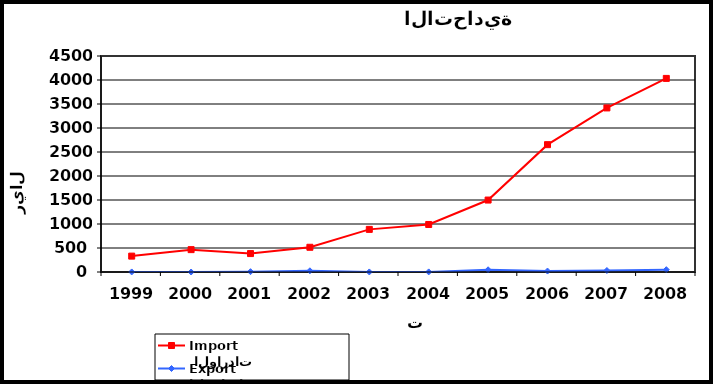
| Category |  الواردات           Import | الصادرات          Export |
|---|---|---|
| 1999.0 | 331 | 1 |
| 2000.0 | 466 | 0 |
| 2001.0 | 384 | 7 |
| 2002.0 | 515 | 25 |
| 2003.0 | 888 | 1 |
| 2004.0 | 990 | 2 |
| 2005.0 | 1499 | 46 |
| 2006.0 | 2653 | 20 |
| 2007.0 | 3418 | 31 |
| 2008.0 | 4033 | 48 |